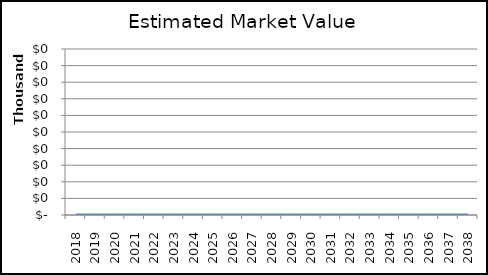
| Category | Series 0 |
|---|---|
| 2018.0 | 0 |
| 2019.0 | 0 |
| 2020.0 | 0 |
| 2021.0 | 0 |
| 2022.0 | 0 |
| 2023.0 | 0 |
| 2024.0 | 0 |
| 2025.0 | 0 |
| 2026.0 | 0 |
| 2027.0 | 0 |
| 2028.0 | 0 |
| 2029.0 | 0 |
| 2030.0 | 0 |
| 2031.0 | 0 |
| 2032.0 | 0 |
| 2033.0 | 0 |
| 2034.0 | 0 |
| 2035.0 | 0 |
| 2036.0 | 0 |
| 2037.0 | 0 |
| 2038.0 | 0 |